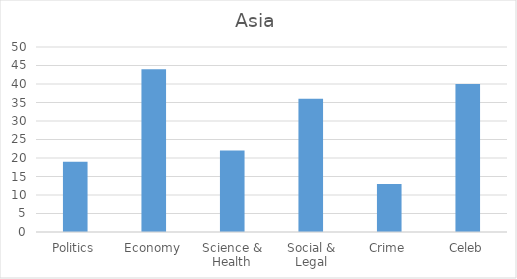
| Category | Asia |
|---|---|
| Politics | 19 |
| Economy | 44 |
| Science & Health | 22 |
| Social & Legal | 36 |
| Crime | 13 |
| Celeb | 40 |